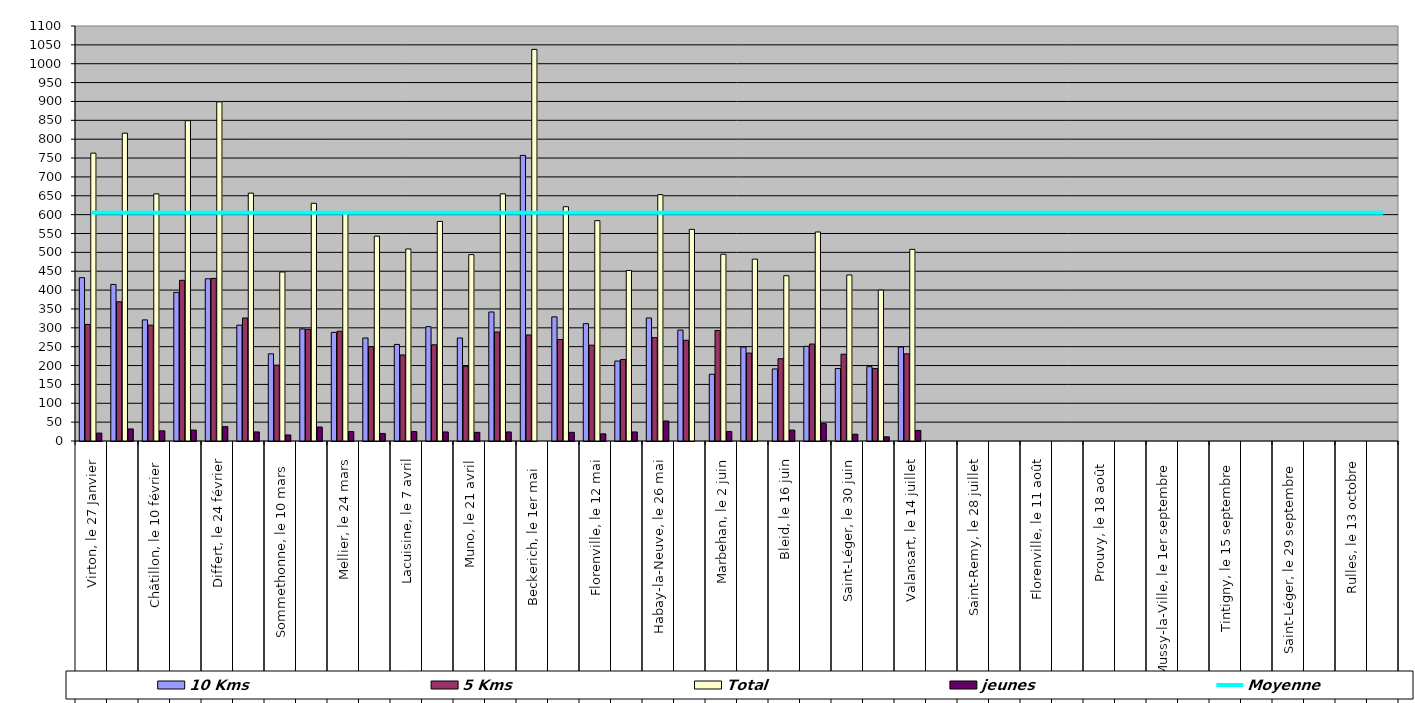
| Category | 10 Kms | 5 Kms | Total | jeunes |
|---|---|---|---|---|
| 0 | 433 | 309 | 763 | 21 |
| 1 | 415 | 369 | 816 | 32 |
| 2 | 321 | 307 | 655 | 27 |
| 3 | 394 | 426 | 849 | 29 |
| 4 | 430 | 431 | 899 | 38 |
| 5 | 307 | 326 | 657 | 24 |
| 6 | 231 | 201 | 448 | 16 |
| 7 | 297 | 296 | 630 | 37 |
| 8 | 288 | 291 | 604 | 25 |
| 9 | 273 | 250 | 543 | 20 |
| 10 | 256 | 228 | 509 | 25 |
| 11 | 303 | 255 | 582 | 24 |
| 12 | 273 | 198 | 494 | 23 |
| 13 | 342 | 289 | 655 | 24 |
| 14 | 757 | 281 | 1038 | 0 |
| 15 | 329 | 269 | 621 | 23 |
| 16 | 311 | 254 | 584 | 19 |
| 17 | 212 | 216 | 452 | 24 |
| 18 | 326 | 274 | 653 | 53 |
| 19 | 294 | 267 | 561 | 0 |
| 20 | 177 | 293 | 495 | 25 |
| 21 | 249 | 233 | 482 | 0 |
| 22 | 191 | 218 | 438 | 29 |
| 23 | 251 | 257 | 554 | 46 |
| 24 | 192 | 230 | 440 | 18 |
| 25 | 197 | 192 | 400 | 11 |
| 26 | 249 | 231 | 508 | 28 |
| 27 | 0 | 0 | 0 | 0 |
| 28 | 0 | 0 | 0 | 0 |
| 29 | 0 | 0 | 0 | 0 |
| 30 | 0 | 0 | 0 | 0 |
| 31 | 0 | 0 | 0 | 0 |
| 32 | 0 | 0 | 0 | 0 |
| 33 | 0 | 0 | 0 | 0 |
| 34 | 0 | 0 | 0 | 0 |
| 35 | 0 | 0 | 0 | 0 |
| 36 | 0 | 0 | 0 | 0 |
| 37 | 0 | 0 | 0 | 0 |
| 38 | 0 | 0 | 0 | 0 |
| 39 | 0 | 0 | 0 | 0 |
| 40 | 0 | 0 | 0 | 0 |
| 41 | 0 | 0 | 0 | 0 |